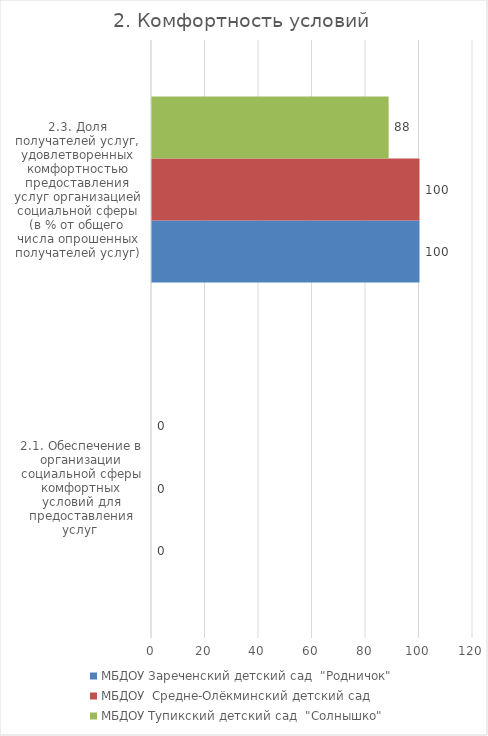
| Category | МБДОУ Зареченский детский сад  "Родничок" | МБДОУ  Средне-Олёкминский детский сад  | МБДОУ Тупикский детский сад  "Солнышко" |
|---|---|---|---|
| 2.1. Обеспечение в организации социальной сферы комфортных условий для предоставления услуг  | 0 | 0 | 0 |
| 2.3. Доля получателей услуг, удовлетворенных комфортностью предоставления услуг организацией социальной сферы (в % от общего числа опрошенных получателей услуг) | 100 | 100 | 88.462 |